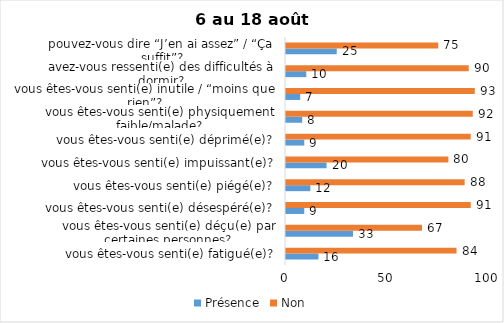
| Category | Présence | Non |
|---|---|---|
| vous êtes-vous senti(e) fatigué(e)? | 16 | 84 |
| vous êtes-vous senti(e) déçu(e) par certaines personnes? | 33 | 67 |
| vous êtes-vous senti(e) désespéré(e)? | 9 | 91 |
| vous êtes-vous senti(e) piégé(e)? | 12 | 88 |
| vous êtes-vous senti(e) impuissant(e)? | 20 | 80 |
| vous êtes-vous senti(e) déprimé(e)? | 9 | 91 |
| vous êtes-vous senti(e) physiquement faible/malade? | 8 | 92 |
| vous êtes-vous senti(e) inutile / “moins que rien”? | 7 | 93 |
| avez-vous ressenti(e) des difficultés à dormir? | 10 | 90 |
| pouvez-vous dire “J’en ai assez” / “Ça suffit”? | 25 | 75 |